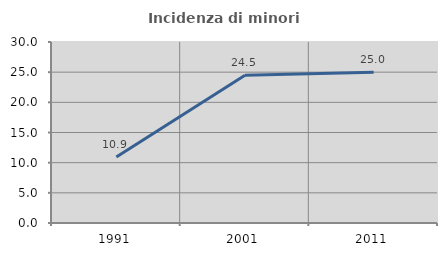
| Category | Incidenza di minori stranieri |
|---|---|
| 1991.0 | 10.938 |
| 2001.0 | 24.479 |
| 2011.0 | 25 |